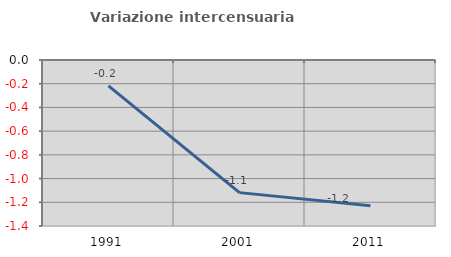
| Category | Variazione intercensuaria annua |
|---|---|
| 1991.0 | -0.218 |
| 2001.0 | -1.118 |
| 2011.0 | -1.23 |